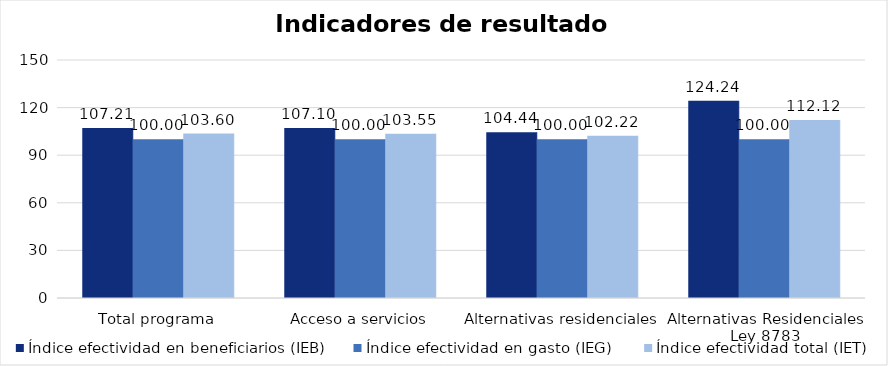
| Category | Índice efectividad en beneficiarios (IEB) | Índice efectividad en gasto (IEG)  | Índice efectividad total (IET) |
|---|---|---|---|
| Total programa | 107.208 | 100 | 103.604 |
| Acceso a servicios | 107.098 | 100.003 | 103.551 |
| Alternativas residenciales | 104.435 | 100 | 102.218 |
| Alternativas Residenciales Ley 8783 | 124.242 | 100 | 112.121 |